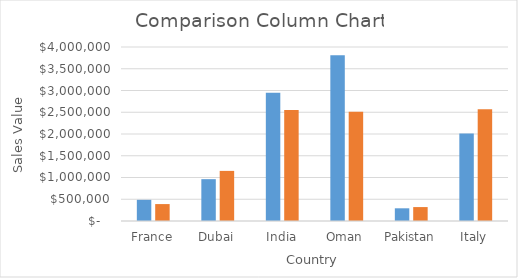
| Category | Sales (2020) | Sales (2021) |
|---|---|---|
| France | 486502 | 389000 |
| Dubai | 961675 | 1151865 |
| India | 2949444 | 2549333 |
| Oman | 3809242 | 2513099 |
| Pakistan | 291853 | 320037 |
| Italy | 2008677 | 2570844 |